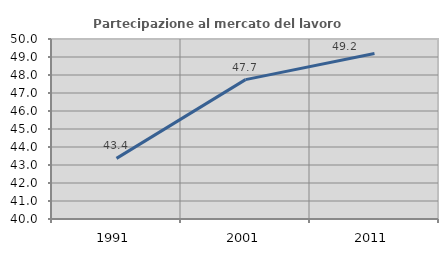
| Category | Partecipazione al mercato del lavoro  femminile |
|---|---|
| 1991.0 | 43.368 |
| 2001.0 | 47.745 |
| 2011.0 | 49.19 |